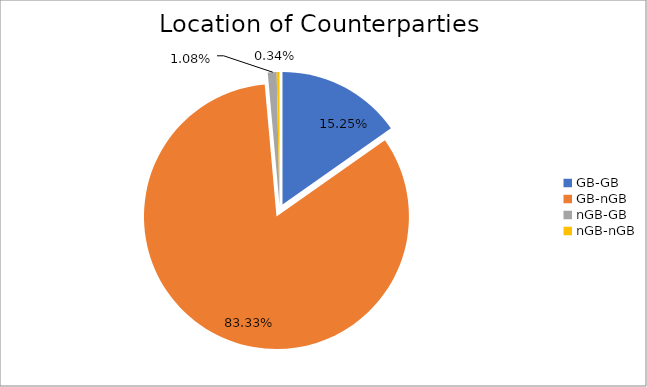
| Category | Series 0 |
|---|---|
| GB-GB | 1524802.811 |
| GB-nGB | 8332193.194 |
| nGB-GB | 107690.131 |
| nGB-nGB | 34206.95 |